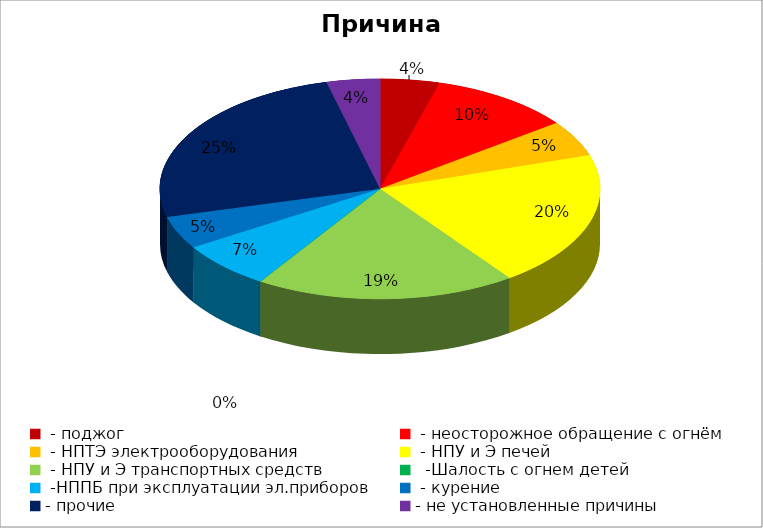
| Category | Причина пожара |
|---|---|
|  - поджог | 10 |
|  - неосторожное обращение с огнём | 24 |
|  - НПТЭ электрооборудования | 12 |
|  - НПУ и Э печей | 46 |
|  - НПУ и Э транспортных средств | 44 |
|   -Шалость с огнем детей | 0 |
|  -НППБ при эксплуатации эл.приборов | 16 |
|  - курение | 11 |
| - прочие | 58 |
| - не установленные причины | 9 |